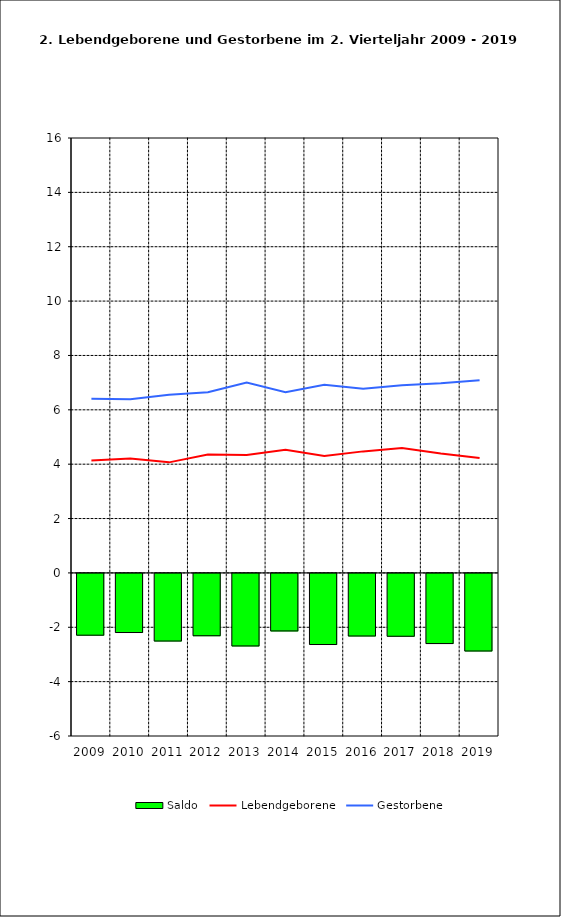
| Category | Saldo |
|---|---|
| 2009.0 | -2.273 |
| 2010.0 | -2.175 |
| 2011.0 | -2.488 |
| 2012.0 | -2.293 |
| 2013.0 | -2.669 |
| 2014.0 | -2.117 |
| 2015.0 | -2.616 |
| 2016.0 | -2.303 |
| 2017.0 | -2.312 |
| 2018.0 | -2.581 |
| 2019.0 | -2.855 |